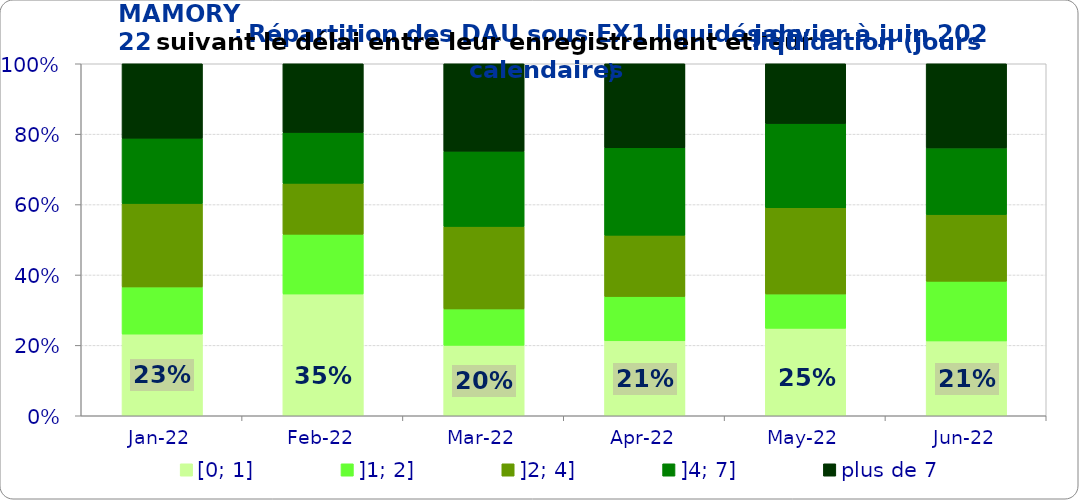
| Category | [0; 1] | ]1; 2] | ]2; 4] | ]4; 7] | plus de 7 |
|---|---|---|---|---|---|
| 2022-01-01 | 0.232 | 0.134 | 0.237 | 0.186 | 0.211 |
| 2022-02-01 | 0.346 | 0.17 | 0.145 | 0.145 | 0.195 |
| 2022-03-01 | 0.2 | 0.103 | 0.234 | 0.214 | 0.248 |
| 2022-04-01 | 0.213 | 0.126 | 0.174 | 0.248 | 0.239 |
| 2022-05-01 | 0.248 | 0.097 | 0.245 | 0.239 | 0.17 |
| 2022-06-01 | 0.213 | 0.169 | 0.189 | 0.189 | 0.239 |